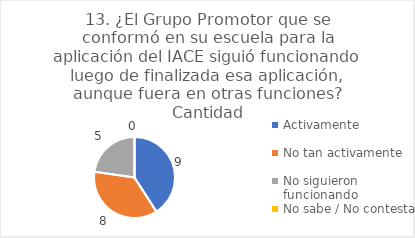
| Category | 13. ¿El Grupo Promotor que se conformó en su escuela para la aplicación del IACE siguió funcionando luego de finalizada esa aplicación, aunque fuera en otras funciones? |
|---|---|
| Activamente  | 0.409 |
| No tan activamente  | 0.364 |
| No siguieron funcionando  | 0.227 |
| No sabe / No contesta | 0 |